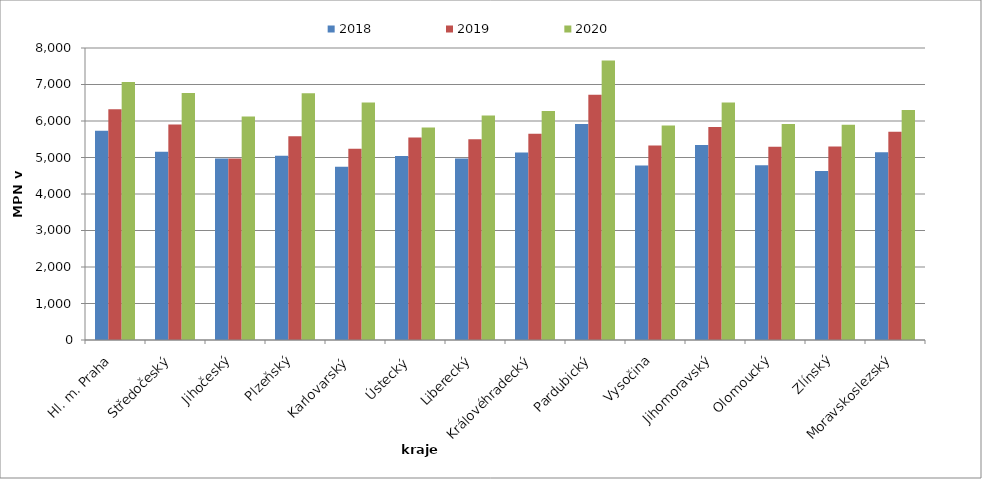
| Category | 2018 | 2019 | 2020 |
|---|---|---|---|
| Hl. m. Praha | 5733 | 6320 | 7071 |
| Středočeský | 5160 | 5907 | 6766 |
| Jihočeský | 4973 | 4973 | 6121 |
| Plzeňský | 5047 | 5585 | 6760 |
| Karlovarský  | 4749 | 5238 | 6504 |
| Ústecký   | 5043 | 5548 | 5819 |
| Liberecký | 4973 | 5501 | 6150 |
| Královéhradecký | 5139 | 5653 | 6274 |
| Pardubický | 5915 | 6717 | 7656 |
| Vysočina | 4778 | 5327 | 5878 |
| Jihomoravský | 5345 | 5837 | 6509 |
| Olomoucký | 4791 | 5295 | 5920 |
| Zlínský | 4632 | 5300 | 5895 |
| Moravskoslezský | 5141 | 5708 | 6304 |